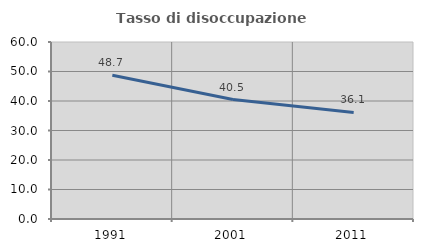
| Category | Tasso di disoccupazione giovanile  |
|---|---|
| 1991.0 | 48.717 |
| 2001.0 | 40.49 |
| 2011.0 | 36.123 |